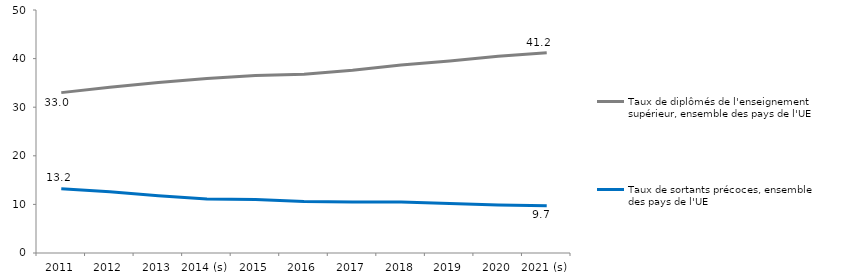
| Category | Taux de diplômés de l'enseignement supérieur, ensemble des pays de l'UE | Taux de sortants précoces, ensemble des pays de l'UE |
|---|---|---|
| 2011 | 33 | 13.2 |
| 2012 | 34.1 | 12.6 |
| 2013 | 35.1 | 11.8 |
| 2014 (s) | 35.9 | 11.1 |
| 2015 | 36.5 | 11 |
| 2016 | 36.8 | 10.6 |
| 2017 | 37.6 | 10.5 |
| 2018 | 38.7 | 10.5 |
| 2019 | 39.5 | 10.2 |
| 2020 | 40.5 | 9.9 |
| 2021 (s) | 41.2 | 9.7 |